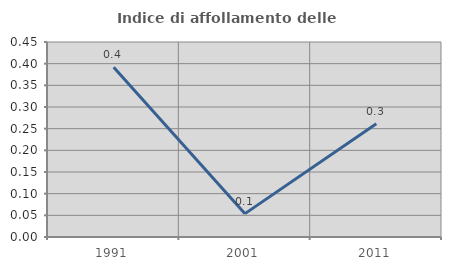
| Category | Indice di affollamento delle abitazioni  |
|---|---|
| 1991.0 | 0.392 |
| 2001.0 | 0.054 |
| 2011.0 | 0.262 |